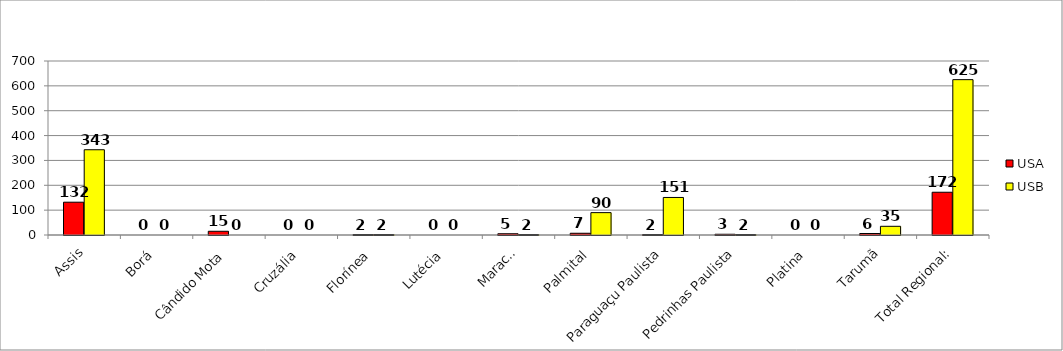
| Category | USA | USB |
|---|---|---|
| Assis | 132 | 343 |
| Borá | 0 | 0 |
| Cândido Mota | 15 | 0 |
| Cruzália | 0 | 0 |
| Florínea | 2 | 2 |
| Lutécia | 0 | 0 |
| Maracaí | 5 | 2 |
| Palmital | 7 | 90 |
| Paraguaçu Paulista | 2 | 151 |
| Pedrinhas Paulista | 3 | 2 |
| Platina | 0 | 0 |
| Tarumã | 6 | 35 |
| Total Regional: | 172 | 625 |